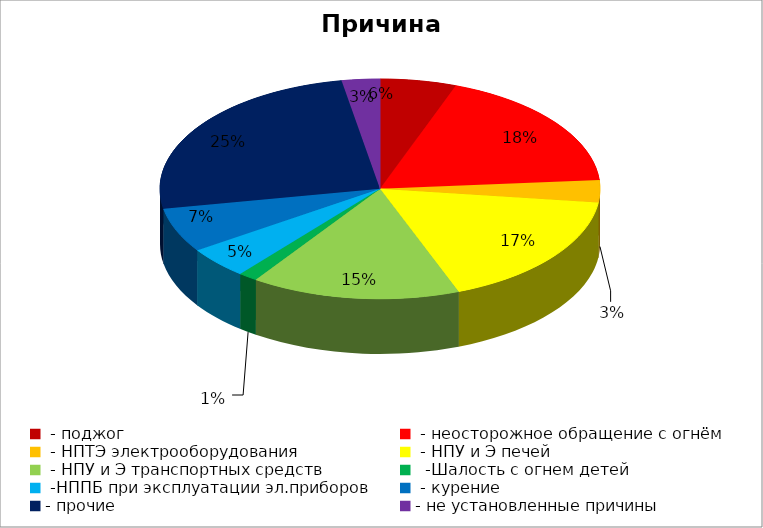
| Category | Причина пожара |
|---|---|
|  - поджог | 12 |
|  - неосторожное обращение с огнём | 39 |
|  - НПТЭ электрооборудования | 7 |
|  - НПУ и Э печей | 37 |
|  - НПУ и Э транспортных средств | 33 |
|   -Шалость с огнем детей | 3 |
|  -НППБ при эксплуатации эл.приборов | 10 |
|  - курение | 14 |
| - прочие | 54 |
| - не установленные причины | 6 |